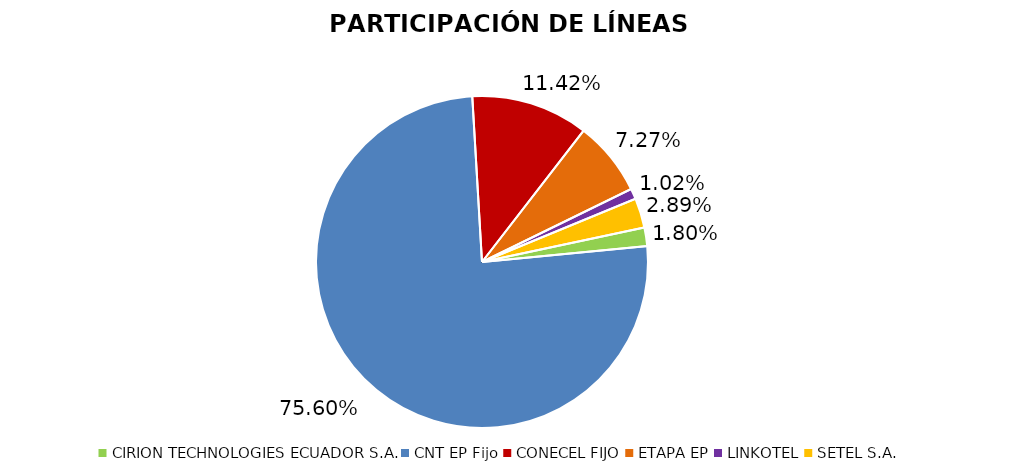
| Category | Participación en el Mercado |
|---|---|
| CIRION TECHNOLOGIES ECUADOR S.A. | 0.018 |
| CNT EP Fijo | 0.756 |
| CONECEL FIJO | 0.114 |
| ETAPA EP | 0.073 |
| LINKOTEL | 0.01 |
| SETEL S.A. | 0.029 |